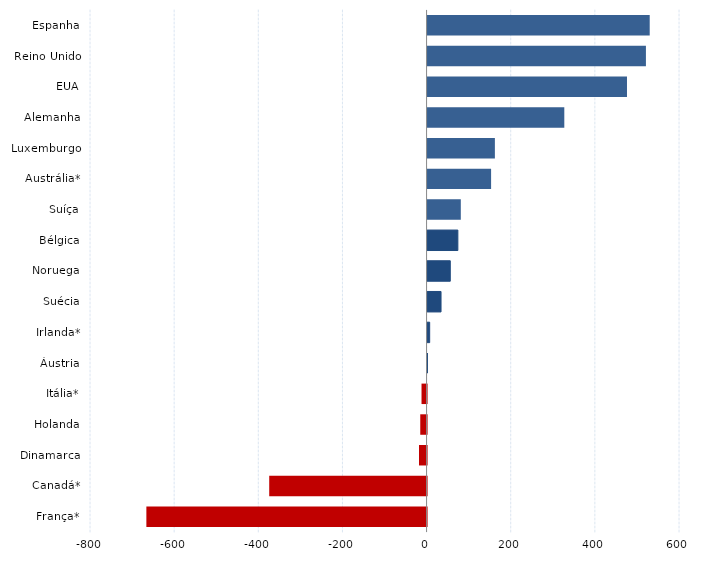
| Category | Series 0 |
|---|---|
| França* | -666 |
| Canadá* | -374 |
| Dinamarca | -18 |
| Holanda | -15 |
| Itália* | -12 |
| Áustria | 1 |
| Irlanda* | 5 |
| Suécia | 32 |
| Noruega | 54 |
| Bélgica | 72 |
| Suíça | 79 |
| Austrália* | 151 |
| Luxemburgo | 160 |
| Alemanha | 325 |
| EUA | 474 |
| Reino Unido | 519 |
| Espanha | 528 |